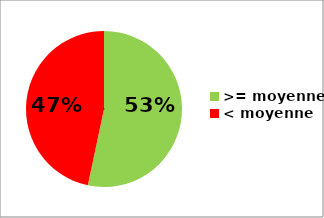
| Category | Series 0 |
|---|---|
| >= moyenne | 8 |
| < moyenne | 7 |